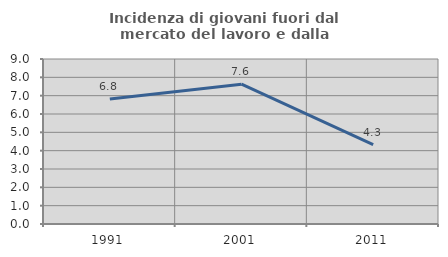
| Category | Incidenza di giovani fuori dal mercato del lavoro e dalla formazione  |
|---|---|
| 1991.0 | 6.816 |
| 2001.0 | 7.628 |
| 2011.0 | 4.333 |